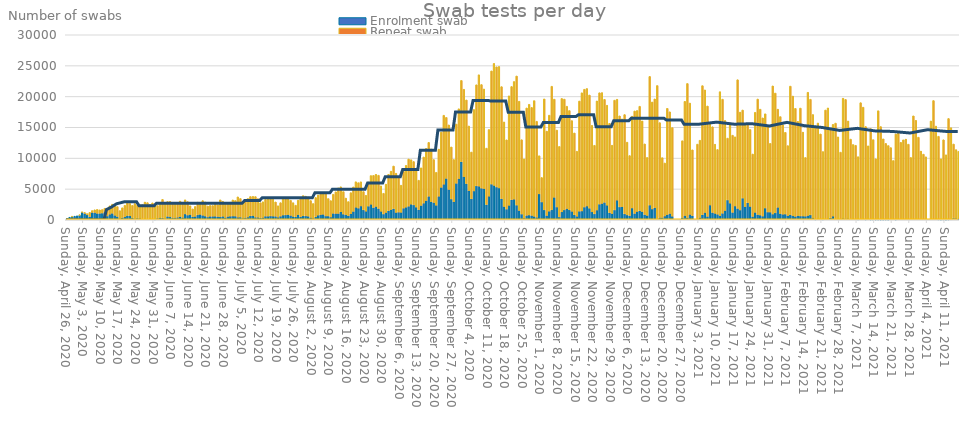
| Category | Enrolment swab | Repeat swab |
|---|---|---|
| 2020-04-26 | 223 | 0 |
| 2020-04-27 | 414 | 0 |
| 2020-04-28 | 507 | 5 |
| 2020-04-29 | 583 | 0 |
| 2020-04-30 | 653 | 0 |
| 2020-05-01 | 747 | 13 |
| 2020-05-02 | 1209 | 67 |
| 2020-05-03 | 1022 | 162 |
| 2020-05-04 | 799 | 210 |
| 2020-05-05 | 505 | 693 |
| 2020-05-06 | 1184 | 321 |
| 2020-05-07 | 1174 | 454 |
| 2020-05-08 | 1037 | 652 |
| 2020-05-09 | 1035 | 585 |
| 2020-05-10 | 1086 | 579 |
| 2020-05-11 | 1239 | 636 |
| 2020-05-12 | 611 | 1056 |
| 2020-05-13 | 911 | 1360 |
| 2020-05-14 | 1047 | 1483 |
| 2020-05-15 | 716 | 1736 |
| 2020-05-16 | 532 | 1616 |
| 2020-05-17 | 220 | 1269 |
| 2020-05-18 | 346 | 1612 |
| 2020-05-19 | 480 | 1884 |
| 2020-05-20 | 684 | 2245 |
| 2020-05-21 | 639 | 2016 |
| 2020-05-22 | 354 | 1996 |
| 2020-05-23 | 209 | 2443 |
| 2020-05-24 | 280 | 2121 |
| 2020-05-25 | 249 | 2157 |
| 2020-05-26 | 152 | 2299 |
| 2020-05-27 | 134 | 2744 |
| 2020-05-28 | 173 | 2621 |
| 2020-05-29 | 148 | 2360 |
| 2020-05-30 | 77 | 2675 |
| 2020-05-31 | 48 | 2279 |
| 2020-06-01 | 255 | 2059 |
| 2020-06-02 | 321 | 2352 |
| 2020-06-03 | 316 | 3003 |
| 2020-06-04 | 218 | 2566 |
| 2020-06-05 | 555 | 2409 |
| 2020-06-06 | 475 | 2522 |
| 2020-06-07 | 360 | 2303 |
| 2020-06-08 | 315 | 2444 |
| 2020-06-09 | 409 | 2379 |
| 2020-06-10 | 503 | 2536 |
| 2020-06-11 | 388 | 2197 |
| 2020-06-12 | 949 | 2301 |
| 2020-06-13 | 767 | 2183 |
| 2020-06-14 | 837 | 1445 |
| 2020-06-15 | 503 | 1271 |
| 2020-06-16 | 541 | 1623 |
| 2020-06-17 | 799 | 2067 |
| 2020-06-18 | 869 | 1929 |
| 2020-06-19 | 726 | 2387 |
| 2020-06-20 | 602 | 2307 |
| 2020-06-21 | 457 | 1791 |
| 2020-06-22 | 558 | 1777 |
| 2020-06-23 | 564 | 1755 |
| 2020-06-24 | 570 | 1980 |
| 2020-06-25 | 517 | 1916 |
| 2020-06-26 | 475 | 2772 |
| 2020-06-27 | 560 | 2445 |
| 2020-06-28 | 370 | 2174 |
| 2020-06-29 | 542 | 2065 |
| 2020-06-30 | 585 | 2277 |
| 2020-07-01 | 609 | 2624 |
| 2020-07-02 | 597 | 2535 |
| 2020-07-03 | 414 | 3313 |
| 2020-07-04 | 435 | 3030 |
| 2020-07-05 | 274 | 2722 |
| 2020-07-06 | 356 | 2819 |
| 2020-07-07 | 429 | 3028 |
| 2020-07-08 | 640 | 3138 |
| 2020-07-09 | 671 | 3120 |
| 2020-07-10 | 416 | 3355 |
| 2020-07-11 | 395 | 3033 |
| 2020-07-12 | 330 | 2448 |
| 2020-07-13 | 372 | 2565 |
| 2020-07-14 | 586 | 2726 |
| 2020-07-15 | 576 | 3041 |
| 2020-07-16 | 623 | 2995 |
| 2020-07-17 | 591 | 2735 |
| 2020-07-18 | 569 | 2333 |
| 2020-07-19 | 416 | 1866 |
| 2020-07-20 | 589 | 2194 |
| 2020-07-21 | 765 | 2752 |
| 2020-07-22 | 791 | 2767 |
| 2020-07-23 | 824 | 2768 |
| 2020-07-24 | 714 | 2464 |
| 2020-07-25 | 544 | 2238 |
| 2020-07-26 | 482 | 1894 |
| 2020-07-27 | 820 | 2380 |
| 2020-07-28 | 511 | 2936 |
| 2020-07-29 | 641 | 3287 |
| 2020-07-30 | 630 | 3204 |
| 2020-07-31 | 580 | 3117 |
| 2020-08-01 | 380 | 2746 |
| 2020-08-02 | 252 | 2391 |
| 2020-08-03 | 477 | 3150 |
| 2020-08-04 | 751 | 3276 |
| 2020-08-05 | 851 | 3603 |
| 2020-08-06 | 881 | 3540 |
| 2020-08-07 | 620 | 3759 |
| 2020-08-08 | 614 | 2835 |
| 2020-08-09 | 445 | 2669 |
| 2020-08-10 | 1041 | 3107 |
| 2020-08-11 | 1025 | 3527 |
| 2020-08-12 | 1021 | 4163 |
| 2020-08-13 | 1296 | 4066 |
| 2020-08-14 | 917 | 3663 |
| 2020-08-15 | 798 | 2729 |
| 2020-08-16 | 665 | 2293 |
| 2020-08-17 | 989 | 3410 |
| 2020-08-18 | 1357 | 3982 |
| 2020-08-19 | 2018 | 4163 |
| 2020-08-20 | 1891 | 4135 |
| 2020-08-21 | 2243 | 3931 |
| 2020-08-22 | 1610 | 2982 |
| 2020-08-23 | 1388 | 2589 |
| 2020-08-24 | 2212 | 3917 |
| 2020-08-25 | 2504 | 4671 |
| 2020-08-26 | 1986 | 5221 |
| 2020-08-27 | 2155 | 5217 |
| 2020-08-28 | 1834 | 5403 |
| 2020-08-29 | 1371 | 4139 |
| 2020-08-30 | 938 | 3370 |
| 2020-08-31 | 1177 | 4603 |
| 2020-09-01 | 1472 | 5908 |
| 2020-09-02 | 1641 | 6249 |
| 2020-09-03 | 1805 | 6920 |
| 2020-09-04 | 1181 | 6373 |
| 2020-09-05 | 1241 | 5798 |
| 2020-09-06 | 1199 | 4415 |
| 2020-09-07 | 1886 | 5983 |
| 2020-09-08 | 2033 | 6799 |
| 2020-09-09 | 2202 | 7658 |
| 2020-09-10 | 2517 | 7232 |
| 2020-09-11 | 2414 | 7043 |
| 2020-09-12 | 2054 | 6181 |
| 2020-09-13 | 1646 | 4777 |
| 2020-09-14 | 2316 | 6121 |
| 2020-09-15 | 2698 | 7493 |
| 2020-09-16 | 3109 | 8481 |
| 2020-09-17 | 3807 | 8751 |
| 2020-09-18 | 2939 | 8554 |
| 2020-09-19 | 2799 | 6975 |
| 2020-09-20 | 2350 | 5358 |
| 2020-09-21 | 3813 | 7645 |
| 2020-09-22 | 5257 | 8978 |
| 2020-09-23 | 5768 | 11191 |
| 2020-09-24 | 6708 | 9902 |
| 2020-09-25 | 4906 | 10487 |
| 2020-09-26 | 3371 | 8449 |
| 2020-09-27 | 2918 | 6864 |
| 2020-09-28 | 5910 | 9621 |
| 2020-09-29 | 6674 | 11339 |
| 2020-09-30 | 9414 | 13194 |
| 2020-10-01 | 6976 | 14198 |
| 2020-10-02 | 5866 | 13578 |
| 2020-10-03 | 4706 | 10514 |
| 2020-10-04 | 3396 | 7599 |
| 2020-10-05 | 4682 | 13216 |
| 2020-10-06 | 5496 | 16405 |
| 2020-10-07 | 5443 | 18085 |
| 2020-10-08 | 5129 | 16811 |
| 2020-10-09 | 5042 | 16177 |
| 2020-10-10 | 2458 | 9170 |
| 2020-10-11 | 3824 | 10819 |
| 2020-10-12 | 5779 | 18370 |
| 2020-10-13 | 5566 | 19799 |
| 2020-10-14 | 5318 | 19497 |
| 2020-10-15 | 5161 | 19706 |
| 2020-10-16 | 3427 | 18172 |
| 2020-10-17 | 2136 | 13739 |
| 2020-10-18 | 1727 | 11246 |
| 2020-10-19 | 2337 | 17776 |
| 2020-10-20 | 3261 | 18359 |
| 2020-10-21 | 3335 | 19094 |
| 2020-10-22 | 2376 | 20950 |
| 2020-10-23 | 1501 | 17733 |
| 2020-10-24 | 924 | 12069 |
| 2020-10-25 | 279 | 9604 |
| 2020-10-26 | 715 | 17426 |
| 2020-10-27 | 777 | 17960 |
| 2020-10-28 | 704 | 17524 |
| 2020-10-29 | 555 | 18774 |
| 2020-10-30 | 409 | 15575 |
| 2020-10-31 | 4201 | 6195 |
| 2020-11-01 | 2894 | 3974 |
| 2020-11-02 | 1607 | 18007 |
| 2020-11-03 | 695 | 13686 |
| 2020-11-04 | 1394 | 15578 |
| 2020-11-05 | 1611 | 20052 |
| 2020-11-06 | 3640 | 15935 |
| 2020-11-07 | 2065 | 12491 |
| 2020-11-08 | 461 | 11443 |
| 2020-11-09 | 1278 | 18404 |
| 2020-11-10 | 1603 | 17978 |
| 2020-11-11 | 1813 | 16611 |
| 2020-11-12 | 1611 | 16113 |
| 2020-11-13 | 1360 | 14723 |
| 2020-11-14 | 806 | 13284 |
| 2020-11-15 | 560 | 10567 |
| 2020-11-16 | 1386 | 17882 |
| 2020-11-17 | 1438 | 19171 |
| 2020-11-18 | 2059 | 19116 |
| 2020-11-19 | 2235 | 19060 |
| 2020-11-20 | 1880 | 18362 |
| 2020-11-21 | 1279 | 14031 |
| 2020-11-22 | 956 | 11133 |
| 2020-11-23 | 1572 | 17707 |
| 2020-11-24 | 2535 | 18072 |
| 2020-11-25 | 2643 | 17983 |
| 2020-11-26 | 2824 | 16721 |
| 2020-11-27 | 2355 | 16224 |
| 2020-11-28 | 1157 | 14486 |
| 2020-11-29 | 995 | 11100 |
| 2020-11-30 | 1592 | 17814 |
| 2020-12-01 | 3180 | 16372 |
| 2020-12-02 | 2083 | 14779 |
| 2020-12-03 | 2111 | 14255 |
| 2020-12-04 | 961 | 16109 |
| 2020-12-05 | 783 | 11812 |
| 2020-12-06 | 670 | 9750 |
| 2020-12-07 | 1912 | 14889 |
| 2020-12-08 | 1030 | 16622 |
| 2020-12-09 | 1340 | 16386 |
| 2020-12-10 | 1461 | 16958 |
| 2020-12-11 | 1319 | 14722 |
| 2020-12-12 | 842 | 11471 |
| 2020-12-13 | 702 | 9412 |
| 2020-12-14 | 2378 | 20873 |
| 2020-12-15 | 1750 | 17360 |
| 2020-12-16 | 1963 | 17642 |
| 2020-12-17 | 116 | 21663 |
| 2020-12-18 | 363 | 15390 |
| 2020-12-19 | 361 | 9719 |
| 2020-12-20 | 611 | 8606 |
| 2020-12-21 | 834 | 17245 |
| 2020-12-22 | 1015 | 16505 |
| 2020-12-23 | 578 | 14384 |
| 2020-12-24 | 0 | 0 |
| 2020-12-25 | 0 | 0 |
| 2020-12-26 | 0 | 0 |
| 2020-12-27 | 356 | 12472 |
| 2020-12-28 | 670 | 18540 |
| 2020-12-29 | 355 | 21756 |
| 2020-12-30 | 870 | 18068 |
| 2020-12-31 | 675 | 10679 |
| 2021-01-01 | 0 | 0 |
| 2021-01-02 | 122 | 12152 |
| 2021-01-03 | 353 | 12553 |
| 2021-01-04 | 814 | 20946 |
| 2021-01-05 | 1165 | 19901 |
| 2021-01-06 | 550 | 17911 |
| 2021-01-07 | 2381 | 13217 |
| 2021-01-08 | 1183 | 13913 |
| 2021-01-09 | 1036 | 11220 |
| 2021-01-10 | 903 | 10506 |
| 2021-01-11 | 657 | 20124 |
| 2021-01-12 | 1057 | 18509 |
| 2021-01-13 | 1491 | 14624 |
| 2021-01-14 | 3212 | 10039 |
| 2021-01-15 | 2688 | 13038 |
| 2021-01-16 | 1202 | 12523 |
| 2021-01-17 | 2236 | 11231 |
| 2021-01-18 | 1843 | 20877 |
| 2021-01-19 | 1582 | 15885 |
| 2021-01-20 | 3514 | 14294 |
| 2021-01-21 | 2120 | 13435 |
| 2021-01-22 | 2776 | 12759 |
| 2021-01-23 | 2161 | 12487 |
| 2021-01-24 | 533 | 10138 |
| 2021-01-25 | 1197 | 16237 |
| 2021-01-26 | 844 | 18744 |
| 2021-01-27 | 765 | 17181 |
| 2021-01-28 | 590 | 15941 |
| 2021-01-29 | 1904 | 15294 |
| 2021-01-30 | 1253 | 14007 |
| 2021-01-31 | 1246 | 11154 |
| 2021-02-01 | 922 | 20795 |
| 2021-02-02 | 1124 | 19434 |
| 2021-02-03 | 2015 | 15925 |
| 2021-02-04 | 999 | 15744 |
| 2021-02-05 | 895 | 14499 |
| 2021-02-06 | 929 | 13259 |
| 2021-02-07 | 659 | 11365 |
| 2021-02-08 | 828 | 20857 |
| 2021-02-09 | 641 | 19428 |
| 2021-02-10 | 545 | 17533 |
| 2021-02-11 | 647 | 15316 |
| 2021-02-12 | 618 | 17506 |
| 2021-02-13 | 602 | 13617 |
| 2021-02-14 | 581 | 9524 |
| 2021-02-15 | 682 | 20001 |
| 2021-02-16 | 794 | 18762 |
| 2021-02-17 | 298 | 16775 |
| 2021-02-18 | 47 | 14976 |
| 2021-02-19 | 154 | 15546 |
| 2021-02-20 | 78 | 13849 |
| 2021-02-21 | 48 | 11019 |
| 2021-02-22 | 93 | 17713 |
| 2021-02-23 | 148 | 17997 |
| 2021-02-24 | 330 | 14337 |
| 2021-02-25 | 590 | 14887 |
| 2021-02-26 | 146 | 15540 |
| 2021-02-27 | 0 | 13454 |
| 2021-02-28 | 0 | 10975 |
| 2021-03-01 | 232 | 19487 |
| 2021-03-02 | 215 | 19312 |
| 2021-03-03 | 219 | 15812 |
| 2021-03-04 | 155 | 12930 |
| 2021-03-05 | 168 | 12043 |
| 2021-03-06 | 91 | 11996 |
| 2021-03-07 | 49 | 10192 |
| 2021-03-08 | 106 | 18892 |
| 2021-03-09 | 102 | 18170 |
| 2021-03-10 | 45 | 15082 |
| 2021-03-11 | 84 | 11921 |
| 2021-03-12 | 30 | 14751 |
| 2021-03-13 | 17 | 12987 |
| 2021-03-14 | 24 | 9876 |
| 2021-03-15 | 21 | 17674 |
| 2021-03-16 | 12 | 15111 |
| 2021-03-17 | 14 | 13123 |
| 2021-03-18 | 29 | 12359 |
| 2021-03-19 | 8 | 12038 |
| 2021-03-20 | 0 | 11706 |
| 2021-03-21 | 0 | 9617 |
| 2021-03-22 | 26 | 13896 |
| 2021-03-23 | 0 | 14095 |
| 2021-03-24 | 0 | 12561 |
| 2021-03-25 | 0 | 12973 |
| 2021-03-26 | 0 | 13080 |
| 2021-03-27 | 0 | 12271 |
| 2021-03-28 | 0 | 10111 |
| 2021-03-29 | 0 | 16864 |
| 2021-03-30 | 0 | 16130 |
| 2021-03-31 | 0 | 13405 |
| 2021-04-01 | 0 | 11138 |
| 2021-04-02 | 0 | 10652 |
| 2021-04-03 | 0 | 10225 |
| 2021-04-04 | 0 | 0 |
| 2021-04-05 | 0 | 16027 |
| 2021-04-06 | 0 | 19343 |
| 2021-04-07 | 128 | 15074 |
| 2021-04-08 | 55 | 13501 |
| 2021-04-09 | 6 | 9892 |
| 2021-04-10 | 20 | 12962 |
| 2021-04-11 | 2 | 10545 |
| 2021-04-12 | 38 | 16394 |
| 2021-04-13 | 73 | 14866 |
| 2021-04-14 | 280 | 12014 |
| 2021-04-15 | 241 | 11141 |
| 2021-04-16 | 130 | 10989 |